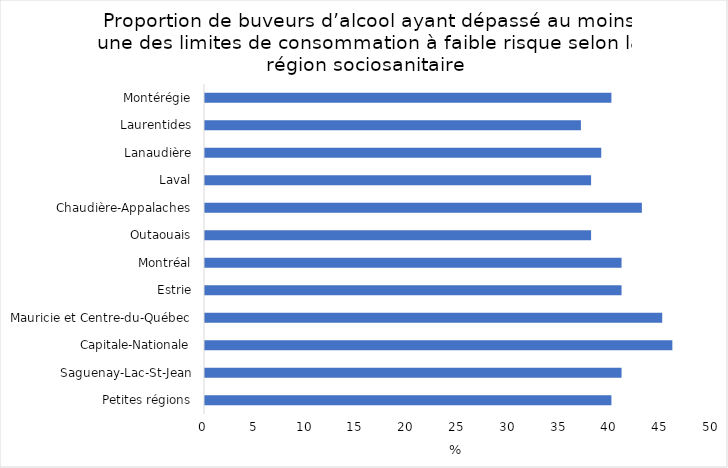
| Category | Series 0 |
|---|---|
| Petites régions | 40 |
| Saguenay-Lac-St-Jean | 41 |
| Capitale-Nationale | 46 |
| Mauricie et Centre-du-Québec | 45 |
| Estrie | 41 |
| Montréal | 41 |
| Outaouais | 38 |
| Chaudière-Appalaches | 43 |
| Laval | 38 |
| Lanaudière | 39 |
| Laurentides | 37 |
| Montérégie | 40 |